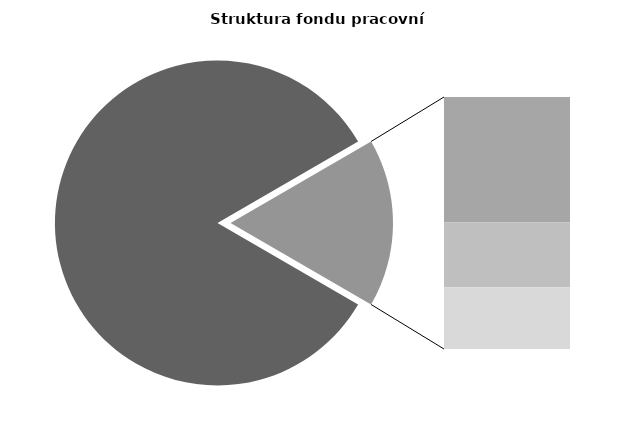
| Category | Series 0 |
|---|---|
| Průměrná měsíční odpracovaná doba bez přesčasu | 141.415 |
| Dovolená | 14.152 |
| Nemoc | 7.28 |
| Jiné | 6.97 |